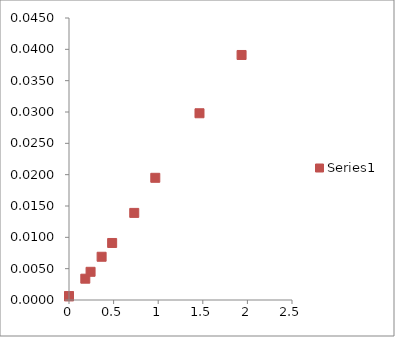
| Category | Series 1 |
|---|---|
| 0.0 | 0.001 |
| 0.0 | 0.001 |
| 0.182860048501917 | 0.003 |
| 0.241836794157068 | 0.004 |
| 0.365720097003833 | 0.007 |
| 0.483673588314135 | 0.009 |
| 0.731440194007666 | 0.014 |
| 0.96734717662827 | 0.02 |
| 1.462880388015333 | 0.03 |
| 1.934694353256541 | 0.039 |